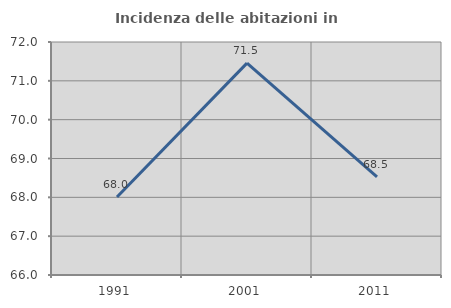
| Category | Incidenza delle abitazioni in proprietà  |
|---|---|
| 1991.0 | 68.007 |
| 2001.0 | 71.456 |
| 2011.0 | 68.529 |